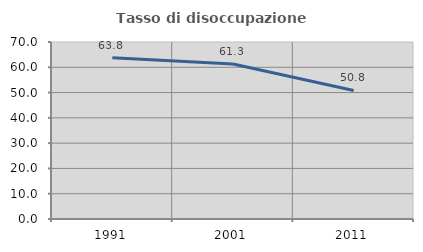
| Category | Tasso di disoccupazione giovanile  |
|---|---|
| 1991.0 | 63.791 |
| 2001.0 | 61.297 |
| 2011.0 | 50.827 |